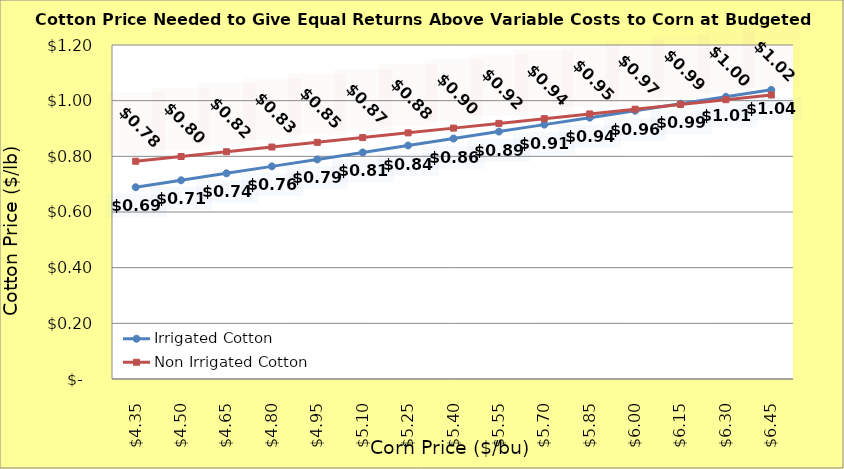
| Category | Irrigated Cotton | Non Irrigated Cotton |
|---|---|---|
| 4.349999999999998 | 0.689 | 0.782 |
| 4.499999999999998 | 0.714 | 0.799 |
| 4.649999999999999 | 0.739 | 0.816 |
| 4.799999999999999 | 0.764 | 0.833 |
| 4.949999999999999 | 0.789 | 0.85 |
| 5.1 | 0.814 | 0.867 |
| 5.25 | 0.839 | 0.884 |
| 5.4 | 0.864 | 0.901 |
| 5.550000000000001 | 0.889 | 0.918 |
| 5.700000000000001 | 0.914 | 0.935 |
| 5.850000000000001 | 0.939 | 0.952 |
| 6.000000000000002 | 0.964 | 0.969 |
| 6.150000000000002 | 0.989 | 0.986 |
| 6.3000000000000025 | 1.014 | 1.003 |
| 6.450000000000003 | 1.039 | 1.02 |